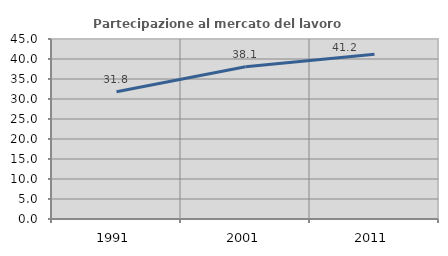
| Category | Partecipazione al mercato del lavoro  femminile |
|---|---|
| 1991.0 | 31.795 |
| 2001.0 | 38.06 |
| 2011.0 | 41.176 |